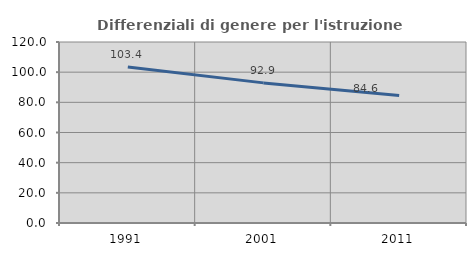
| Category | Differenziali di genere per l'istruzione superiore |
|---|---|
| 1991.0 | 103.399 |
| 2001.0 | 92.896 |
| 2011.0 | 84.6 |